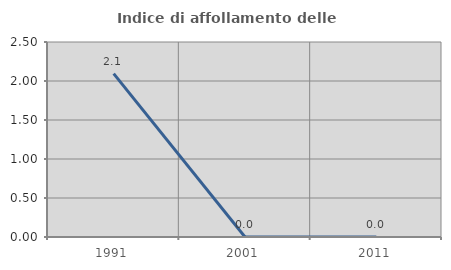
| Category | Indice di affollamento delle abitazioni  |
|---|---|
| 1991.0 | 2.094 |
| 2001.0 | 0 |
| 2011.0 | 0 |